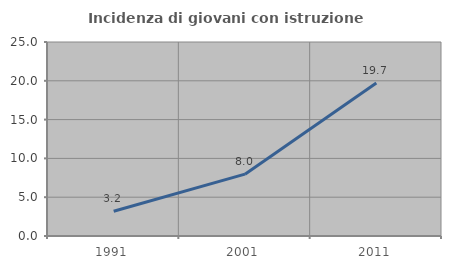
| Category | Incidenza di giovani con istruzione universitaria |
|---|---|
| 1991.0 | 3.185 |
| 2001.0 | 7.971 |
| 2011.0 | 19.728 |